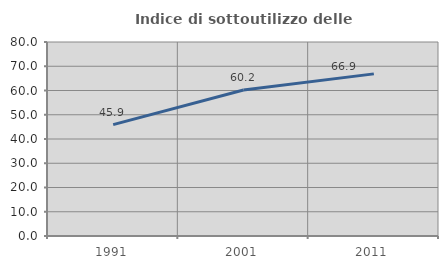
| Category | Indice di sottoutilizzo delle abitazioni  |
|---|---|
| 1991.0 | 45.946 |
| 2001.0 | 60.209 |
| 2011.0 | 66.854 |